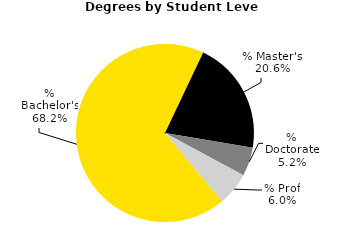
| Category | Series 0 |
|---|---|
| % Bachelor's | 0.682 |
| % Master's | 0.206 |
| % Doctorate | 0.052 |
| % Prof | 0.06 |